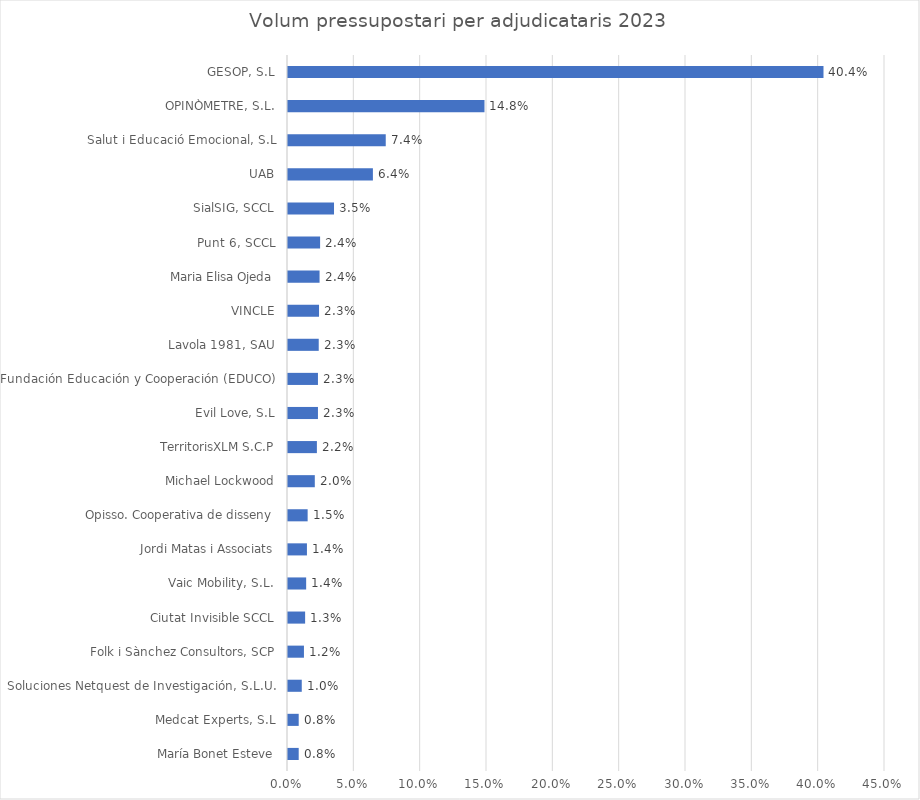
| Category | Series 0 |
|---|---|
| María Bonet Esteve | 0.008 |
| Medcat Experts, S.L | 0.008 |
| Soluciones Netquest de Investigación, S.L.U. | 0.01 |
| Folk i Sànchez Consultors, SCP | 0.012 |
| Ciutat Invisible SCCL | 0.013 |
| Vaic Mobility, S.L. | 0.014 |
| Jordi Matas i Associats | 0.014 |
| Opisso. Cooperativa de disseny | 0.015 |
| Michael Lockwood | 0.02 |
| TerritorisXLM S.C.P | 0.022 |
| Evil Love, S.L | 0.023 |
| Fundación Educación y Cooperación (EDUCO) | 0.023 |
| Lavola 1981, SAU | 0.023 |
| VINCLE | 0.023 |
| Maria Elisa Ojeda | 0.024 |
| Punt 6, SCCL | 0.024 |
| SialSIG, SCCL | 0.035 |
| UAB | 0.064 |
| Salut i Educació Emocional, S.L | 0.074 |
| OPINÒMETRE, S.L. | 0.148 |
| GESOP, S.L | 0.404 |